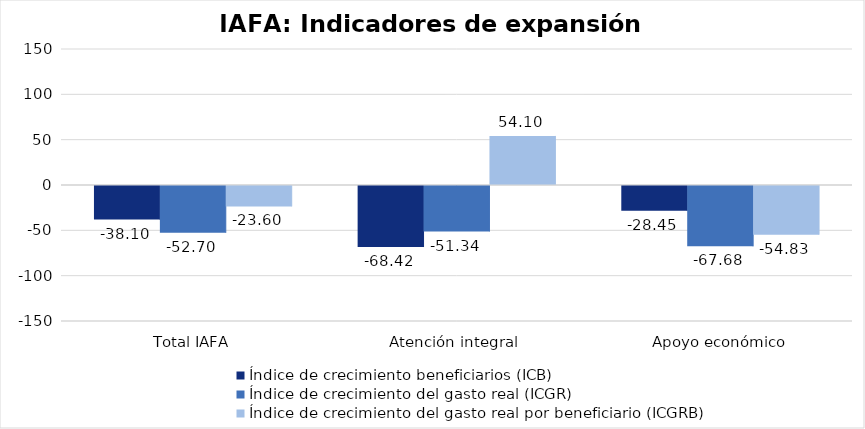
| Category | Índice de crecimiento beneficiarios (ICB)  | Índice de crecimiento del gasto real (ICGR)  | Índice de crecimiento del gasto real por beneficiario (ICGRB)  |
|---|---|---|---|
| Total IAFA | -38.095 | -52.704 | -23.598 |
| Atención integral  | -68.421 | -51.336 | 54.103 |
| Apoyo económico | -28.452 | -67.679 | -54.827 |